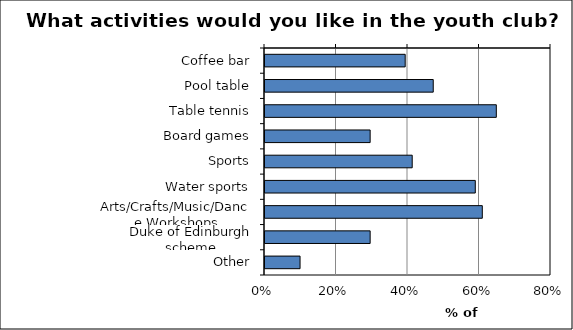
| Category | Series 0 |
|---|---|
| Coffee bar | 0.392 |
| Pool table | 0.471 |
| Table tennis | 0.647 |
| Board games | 0.294 |
| Sports | 0.412 |
| Water sports | 0.588 |
| Arts/Crafts/Music/Dance Workshops | 0.608 |
| Duke of Edinburgh scheme | 0.294 |
| Other | 0.098 |